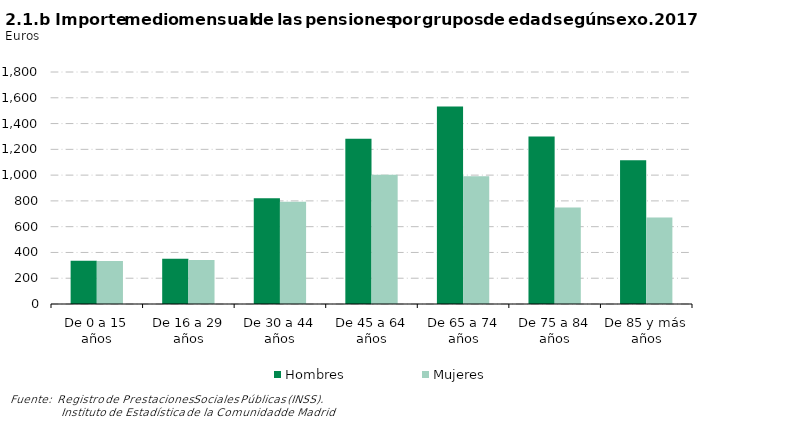
| Category | Hombres | Mujeres |
|---|---|---|
| De 0 a 15 años | 335.043 | 333.074 |
| De 16 a 29 años | 351.052 | 340.808 |
| De 30 a 44 años | 820.859 | 792.813 |
| De 45 a 64 años | 1282.13 | 1003.687 |
| De 65 a 74 años | 1532.571 | 990.701 |
| De 75 a 84 años | 1299.524 | 748.411 |
| De 85 y más años | 1114.553 | 670.874 |